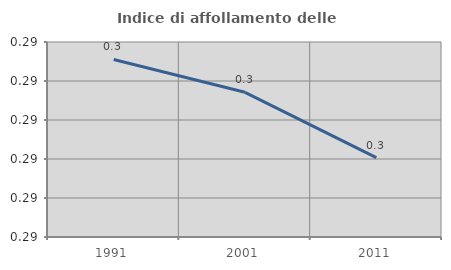
| Category | Indice di affollamento delle abitazioni  |
|---|---|
| 1991.0 | 0.29 |
| 2001.0 | 0.29 |
| 2011.0 | 0.289 |